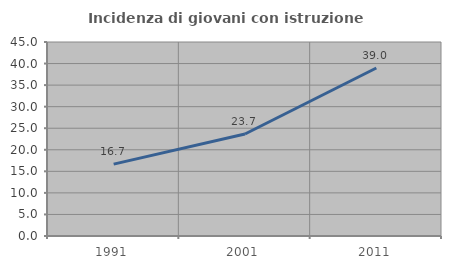
| Category | Incidenza di giovani con istruzione universitaria |
|---|---|
| 1991.0 | 16.669 |
| 2001.0 | 23.659 |
| 2011.0 | 38.974 |